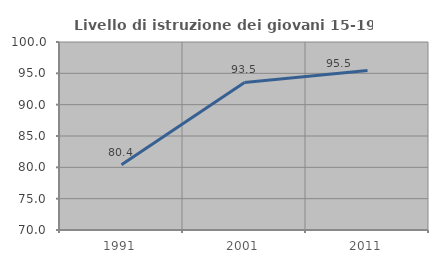
| Category | Livello di istruzione dei giovani 15-19 anni |
|---|---|
| 1991.0 | 80.412 |
| 2001.0 | 93.548 |
| 2011.0 | 95.455 |